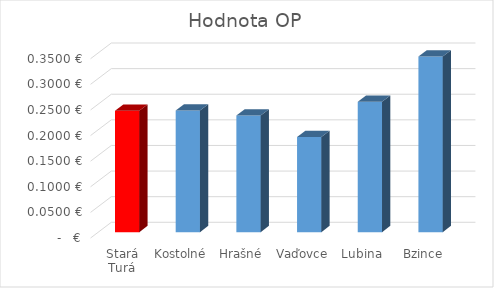
| Category | Hodnota OP |
|---|---|
| Stará Turá | 0.237 |
| Kostolné | 0.238 |
| Hrašné | 0.228 |
| Vaďovce | 0.186 |
| Lubina | 0.255 |
| Bzince | 0.343 |